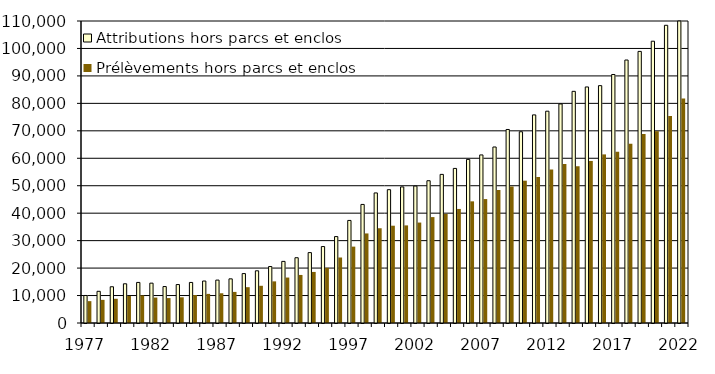
| Category | Attributions hors parcs et enclos | Prélèvements hors parcs et enclos |
|---|---|---|
| 1977.0 | 10023 | 7958 |
| 1978.0 | 11544 | 8429 |
| 1979.0 | 13201 | 8824 |
| 1980.0 | 14284 | 9853 |
| 1981.0 | 14780 | 10042 |
| 1982.0 | 14516 | 9265 |
| 1983.0 | 13272 | 9076 |
| 1984.0 | 14006 | 9358 |
| 1985.0 | 14770 | 10195 |
| 1986.0 | 15288 | 10603 |
| 1987.0 | 15632 | 10829 |
| 1988.0 | 16078 | 11325 |
| 1989.0 | 17998 | 13045 |
| 1990.0 | 19013 | 13555 |
| 1991.0 | 20567 | 15163 |
| 1992.0 | 22446 | 16555 |
| 1993.0 | 23777 | 17505 |
| 1994.0 | 25639 | 18600 |
| 1995.0 | 27843 | 20084 |
| 1996.0 | 31478 | 23857 |
| 1997.0 | 37362 | 27820 |
| 1998.0 | 43190 | 32622 |
| 1999.0 | 47374 | 34514 |
| 2000.0 | 48563 | 35437 |
| 2001.0 | 49565 | 35553 |
| 2002.0 | 49880 | 36584 |
| 2003.0 | 51819 | 38575 |
| 2004.0 | 54130 | 39734 |
| 2005.0 | 56306 | 41544 |
| 2006.0 | 59586 | 44310 |
| 2007.0 | 61220 | 45137 |
| 2008.0 | 64110 | 48460 |
| 2009.0 | 70491 | 49693 |
| 2010.0 | 69655 | 51836 |
| 2011.0 | 75801 | 53181 |
| 2012.0 | 77145 | 55925 |
| 2013.0 | 79789 | 57931 |
| 2014.0 | 84383 | 57131 |
| 2015.0 | 85974 | 59026 |
| 2016.0 | 86450 | 61412 |
| 2017.0 | 90515 | 62418 |
| 2018.0 | 95786 | 65275 |
| 2019.0 | 98925 | 68883 |
| 2020.0 | 102636 | 69876 |
| 2021.0 | 108438 | 75397 |
| 2022.0 | 116750 | 81758 |